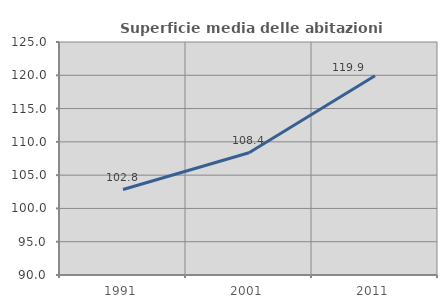
| Category | Superficie media delle abitazioni occupate |
|---|---|
| 1991.0 | 102.84 |
| 2001.0 | 108.366 |
| 2011.0 | 119.942 |